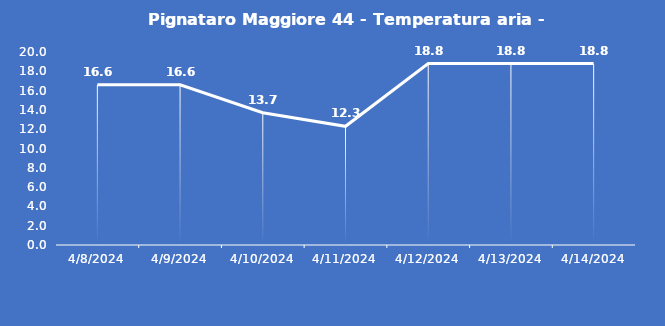
| Category | Pignataro Maggiore 44 - Temperatura aria - Grezzo (°C) |
|---|---|
| 4/8/24 | 16.6 |
| 4/9/24 | 16.6 |
| 4/10/24 | 13.7 |
| 4/11/24 | 12.3 |
| 4/12/24 | 18.8 |
| 4/13/24 | 18.8 |
| 4/14/24 | 18.8 |